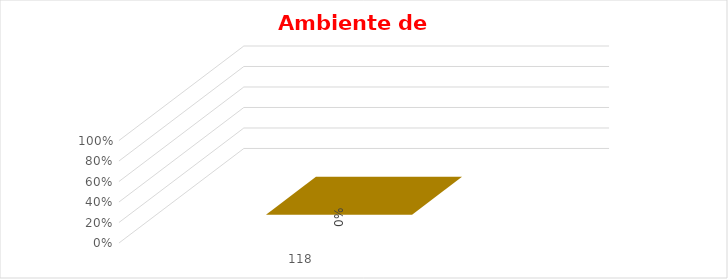
| Category | % Avance |
|---|---|
| 118.0 | 0 |